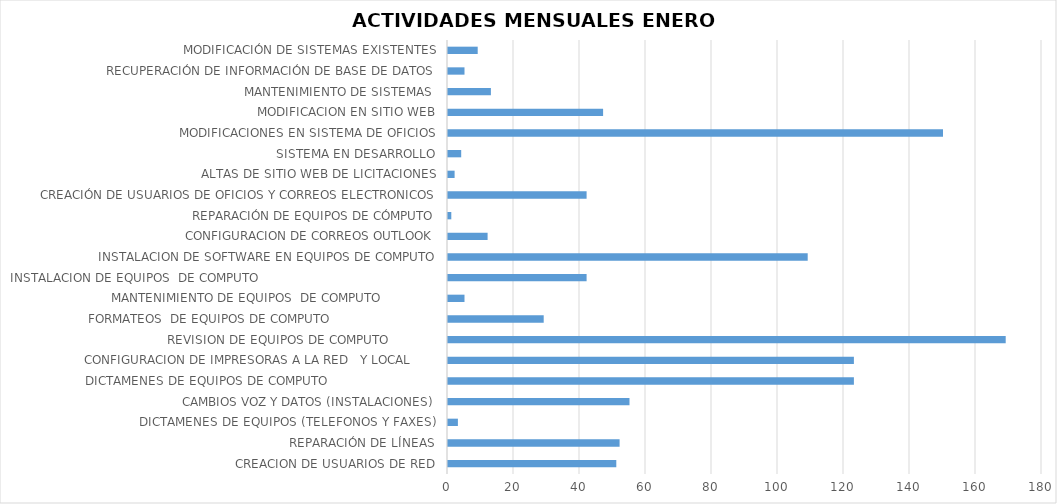
| Category | Series 0 |
|---|---|
| CREACION DE USUARIOS DE RED | 51 |
| REPARACIÓN DE LÍNEAS | 52 |
| DICTAMENES DE EQUIPOS (TELEFONOS Y FAXES) | 3 |
| CAMBIOS VOZ Y DATOS (INSTALACIONES) | 55 |
| DICTAMENES DE EQUIPOS DE COMPUTO                             | 123 |
| CONFIGURACION DE IMPRESORAS A LA RED   Y LOCAL       | 123 |
| REVISION DE EQUIPOS DE COMPUTO             | 169 |
| FORMATEOS  DE EQUIPOS DE COMPUTO                            | 29 |
| MANTENIMIENTO DE EQUIPOS  DE COMPUTO               | 5 |
| INSTALACION DE EQUIPOS  DE COMPUTO                                               | 42 |
| INSTALACION DE SOFTWARE EN EQUIPOS DE COMPUTO | 109 |
| CONFIGURACION DE CORREOS OUTLOOK | 12 |
| REPARACIÓN DE EQUIPOS DE CÓMPUTO | 1 |
| CREACIÓN DE USUARIOS DE OFICIOS Y CORREOS ELECTRONICOS | 42 |
| ALTAS DE SITIO WEB DE LICITACIONES | 2 |
| SISTEMA EN DESARROLLO | 4 |
| MODIFICACIONES EN SISTEMA DE OFICIOS | 150 |
| MODIFICACION EN SITIO WEB | 47 |
| MANTENIMIENTO DE SISTEMAS  | 13 |
| RECUPERACIÓN DE INFORMACIÓN DE BASE DE DATOS | 5 |
| MODIFICACIÓN DE SISTEMAS EXISTENTES | 9 |